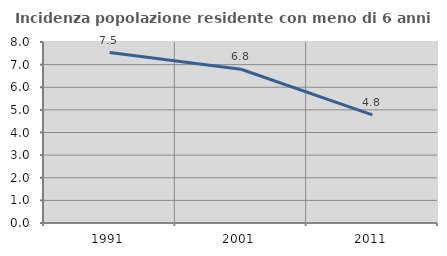
| Category | Incidenza popolazione residente con meno di 6 anni |
|---|---|
| 1991.0 | 7.535 |
| 2001.0 | 6.795 |
| 2011.0 | 4.782 |